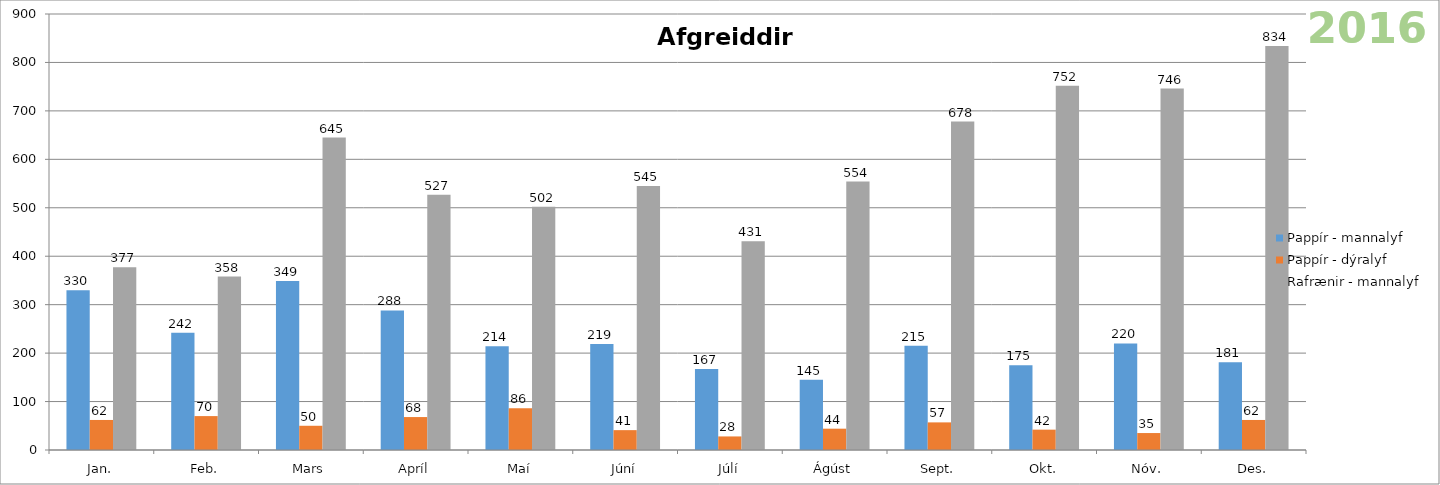
| Category | Pappír - mannalyf | Pappír - dýralyf | Rafrænir - mannalyf |
|---|---|---|---|
| Jan. | 330 | 62 | 377 |
| Feb. | 242 | 70 | 358 |
| Mars | 349 | 50 | 645 |
| Apríl | 288 | 68 | 527 |
| Maí | 214 | 86 | 502 |
| Júní | 219 | 41 | 545 |
| Júlí | 167 | 28 | 431 |
| Ágúst | 145 | 44 | 554 |
| Sept. | 215 | 57 | 678 |
| Okt. | 175 | 42 | 752 |
| Nóv. | 220 | 35 | 746 |
| Des. | 181 | 62 | 834 |